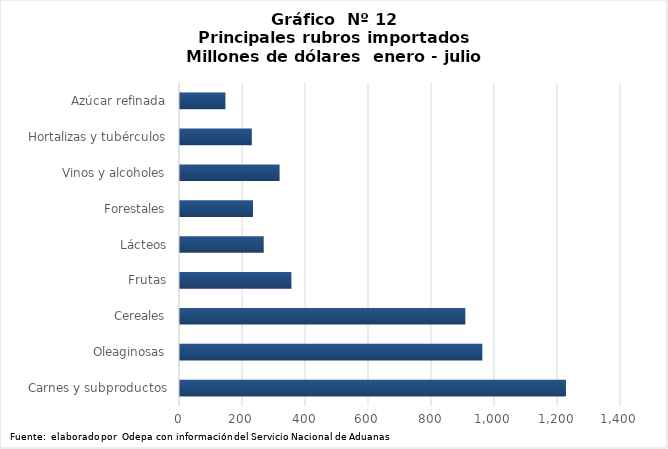
| Category | Series 0 |
|---|---|
| Carnes y subproductos | 1225216.199 |
| Oleaginosas | 959707.197 |
| Cereales | 905832.239 |
| Frutas | 353622.307 |
| Lácteos | 265742.735 |
| Forestales | 231758 |
| Vinos y alcoholes | 316185.963 |
| Hortalizas y tubérculos | 227986.441 |
| Azúcar refinada | 144240.281 |